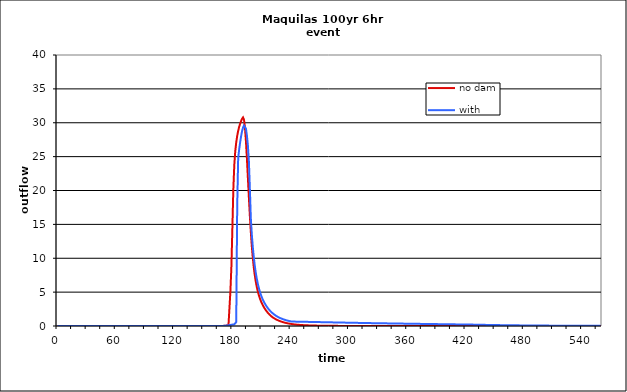
| Category | no dam | with dam |
|---|---|---|
| 0.0 | 0 | 0 |
| 1.0 | 0 | 0 |
| 2.0 | 0 | 0 |
| 3.0 | 0 | 0 |
| 4.0 | 0 | 0 |
| 5.0 | 0 | 0 |
| 6.0 | 0 | 0 |
| 7.0 | 0 | 0 |
| 8.0 | 0 | 0 |
| 9.0 | 0 | 0 |
| 10.0 | 0 | 0 |
| 11.0 | 0 | 0 |
| 12.0 | 0 | 0 |
| 13.0 | 0 | 0 |
| 14.0 | 0 | 0 |
| 15.0 | 0 | 0 |
| 16.0 | 0 | 0 |
| 17.0 | 0 | 0 |
| 18.0 | 0 | 0 |
| 19.0 | 0 | 0 |
| 20.0 | 0 | 0 |
| 21.0 | 0 | 0 |
| 22.0 | 0 | 0 |
| 23.0 | 0 | 0 |
| 24.0 | 0 | 0 |
| 25.0 | 0 | 0 |
| 26.0 | 0 | 0 |
| 27.0 | 0 | 0 |
| 28.0 | 0 | 0 |
| 29.0 | 0 | 0 |
| 30.0 | 0 | 0 |
| 31.0 | 0 | 0 |
| 32.0 | 0 | 0 |
| 33.0 | 0 | 0 |
| 34.0 | 0 | 0 |
| 35.0 | 0 | 0 |
| 36.0 | 0 | 0 |
| 37.0 | 0 | 0 |
| 38.0 | 0 | 0 |
| 39.0 | 0 | 0 |
| 40.0 | 0 | 0 |
| 41.0 | 0 | 0 |
| 42.0 | 0 | 0 |
| 43.0 | 0 | 0 |
| 44.0 | 0 | 0 |
| 45.0 | 0 | 0 |
| 46.0 | 0 | 0 |
| 47.0 | 0 | 0 |
| 48.0 | 0 | 0 |
| 49.0 | 0 | 0 |
| 50.0 | 0 | 0 |
| 51.0 | 0 | 0 |
| 52.0 | 0 | 0 |
| 53.0 | 0 | 0 |
| 54.0 | 0 | 0 |
| 55.0 | 0 | 0 |
| 56.0 | 0 | 0 |
| 57.0 | 0 | 0 |
| 58.0 | 0 | 0 |
| 59.0 | 0 | 0 |
| 60.0 | 0 | 0 |
| 61.0 | 0 | 0 |
| 62.0 | 0 | 0 |
| 63.0 | 0 | 0 |
| 64.0 | 0 | 0 |
| 65.0 | 0 | 0 |
| 66.0 | 0 | 0 |
| 67.0 | 0 | 0 |
| 68.0 | 0 | 0 |
| 69.0 | 0 | 0 |
| 70.0 | 0 | 0 |
| 71.0 | 0 | 0 |
| 72.0 | 0 | 0 |
| 73.0 | 0 | 0 |
| 74.0 | 0 | 0 |
| 75.0 | 0 | 0 |
| 76.0 | 0 | 0 |
| 77.0 | 0 | 0 |
| 78.0 | 0 | 0 |
| 79.0 | 0 | 0 |
| 80.0 | 0 | 0 |
| 81.0 | 0 | 0 |
| 82.0 | 0 | 0 |
| 83.0 | 0 | 0 |
| 84.0 | 0 | 0 |
| 85.0 | 0 | 0 |
| 86.0 | 0 | 0 |
| 87.0 | 0 | 0 |
| 88.0 | 0 | 0 |
| 89.0 | 0 | 0 |
| 90.0 | 0 | 0 |
| 91.0 | 0 | 0 |
| 92.0 | 0 | 0 |
| 93.0 | 0 | 0 |
| 94.0 | 0 | 0 |
| 95.0 | 0 | 0 |
| 96.0 | 0 | 0 |
| 97.0 | 0 | 0 |
| 98.0 | 0 | 0 |
| 99.0 | 0 | 0 |
| 100.0 | 0 | 0 |
| 101.0 | 0 | 0 |
| 102.0 | 0 | 0 |
| 103.0 | 0 | 0 |
| 104.0 | 0 | 0 |
| 105.0 | 0 | 0 |
| 106.0 | 0 | 0 |
| 107.0 | 0 | 0 |
| 108.0 | 0 | 0 |
| 109.0 | 0 | 0 |
| 110.0 | 0 | 0 |
| 111.0 | 0 | 0 |
| 112.0 | 0 | 0 |
| 113.0 | 0 | 0 |
| 114.0 | 0 | 0 |
| 115.0 | 0 | 0 |
| 116.0 | 0 | 0 |
| 117.0 | 0 | 0 |
| 118.0 | 0 | 0 |
| 119.0 | 0 | 0 |
| 120.0 | 0 | 0 |
| 121.0 | 0 | 0 |
| 122.0 | 0 | 0 |
| 123.0 | 0 | 0 |
| 124.0 | 0 | 0 |
| 125.0 | 0 | 0 |
| 126.0 | 0 | 0 |
| 127.0 | 0 | 0 |
| 128.0 | 0 | 0 |
| 129.0 | 0 | 0 |
| 130.0 | 0 | 0 |
| 131.0 | 0 | 0 |
| 132.0 | 0 | 0 |
| 133.0 | 0 | 0 |
| 134.0 | 0 | 0 |
| 135.0 | 0 | 0 |
| 136.0 | 0 | 0 |
| 137.0 | 0 | 0 |
| 138.0 | 0 | 0 |
| 139.0 | 0 | 0 |
| 140.0 | 0 | 0 |
| 141.0 | 0 | 0 |
| 142.0 | 0 | 0 |
| 143.0 | 0 | 0 |
| 144.0 | 0 | 0 |
| 145.0 | 0 | 0 |
| 146.0 | 0 | 0 |
| 147.0 | 0 | 0 |
| 148.0 | 0 | 0 |
| 149.0 | 0 | 0 |
| 150.0 | 0 | 0 |
| 151.0 | 0 | 0 |
| 152.0 | 0 | 0 |
| 153.0 | 0 | 0 |
| 154.0 | 0 | 0 |
| 155.0 | 0 | 0 |
| 156.0 | 0.001 | 0.001 |
| 157.0 | 0.001 | 0.001 |
| 158.0 | 0.001 | 0.001 |
| 159.0 | 0.001 | 0.001 |
| 160.0 | 0.001 | 0.001 |
| 161.0 | 0.001 | 0.001 |
| 162.0 | 0.002 | 0.002 |
| 163.0 | 0.003 | 0.003 |
| 164.0 | 0.003 | 0.003 |
| 165.0 | 0.004 | 0.004 |
| 166.0 | 0.005 | 0.005 |
| 167.0 | 0.006 | 0.006 |
| 168.0 | 0.007 | 0.007 |
| 169.0 | 0.008 | 0.008 |
| 170.0 | 0.01 | 0.01 |
| 171.0 | 0.015 | 0.015 |
| 172.0 | 0.028 | 0.028 |
| 173.0 | 0.046 | 0.044 |
| 174.0 | 0.063 | 0.063 |
| 175.0 | 0.082 | 0.084 |
| 176.0 | 0.076 | 0.106 |
| 177.0 | 0 | 0.129 |
| 178.0 | 5.144 | 0.154 |
| 179.0 | 8.725 | 0.179 |
| 180.0 | 14.254 | 0.204 |
| 181.0 | 20.136 | 0.228 |
| 182.0 | 23.764 | 0.249 |
| 183.0 | 25.814 | 0.324 |
| 184.0 | 27.112 | 0.583 |
| 185.0 | 28.062 | 17.689 |
| 186.0 | 28.805 | 24.79 |
| 187.0 | 29.393 | 26.043 |
| 188.0 | 29.865 | 27.09 |
| 189.0 | 30.248 | 28.011 |
| 190.0 | 30.58 | 28.759 |
| 191.0 | 30.788 | 29.294 |
| 192.0 | 30.45 | 29.58 |
| 193.0 | 29.259 | 29.598 |
| 194.0 | 27.251 | 29.132 |
| 195.0 | 24.685 | 28.089 |
| 196.0 | 21.851 | 26.626 |
| 197.0 | 19.001 | 24.389 |
| 198.0 | 16.317 | 20.408 |
| 199.0 | 13.916 | 15.963 |
| 200.0 | 11.857 | 13.579 |
| 201.0 | 10.132 | 11.751 |
| 202.0 | 8.732 | 10.235 |
| 203.0 | 7.586 | 8.991 |
| 204.0 | 6.644 | 7.958 |
| 205.0 | 5.873 | 7.091 |
| 206.0 | 5.23 | 6.362 |
| 207.0 | 4.684 | 5.747 |
| 208.0 | 4.217 | 5.219 |
| 209.0 | 3.815 | 4.76 |
| 210.0 | 3.469 | 4.36 |
| 211.0 | 3.165 | 4.009 |
| 212.0 | 2.896 | 3.698 |
| 213.0 | 2.654 | 3.421 |
| 214.0 | 2.434 | 3.172 |
| 215.0 | 2.232 | 2.946 |
| 216.0 | 2.045 | 2.741 |
| 217.0 | 1.874 | 2.553 |
| 218.0 | 1.718 | 2.381 |
| 219.0 | 1.575 | 2.222 |
| 220.0 | 1.448 | 2.077 |
| 221.0 | 1.335 | 1.943 |
| 222.0 | 1.232 | 1.818 |
| 223.0 | 1.139 | 1.703 |
| 224.0 | 1.054 | 1.597 |
| 225.0 | 0.975 | 1.499 |
| 226.0 | 0.904 | 1.412 |
| 227.0 | 0.838 | 1.332 |
| 228.0 | 0.776 | 1.259 |
| 229.0 | 0.719 | 1.191 |
| 230.0 | 0.667 | 1.127 |
| 231.0 | 0.618 | 1.068 |
| 232.0 | 0.573 | 1.013 |
| 233.0 | 0.531 | 0.961 |
| 234.0 | 0.493 | 0.913 |
| 235.0 | 0.457 | 0.867 |
| 236.0 | 0.424 | 0.825 |
| 237.0 | 0.394 | 0.785 |
| 238.0 | 0.366 | 0.748 |
| 239.0 | 0.339 | 0.714 |
| 240.0 | 0.315 | 0.685 |
| 241.0 | 0.293 | 0.665 |
| 242.0 | 0.272 | 0.655 |
| 243.0 | 0.253 | 0.651 |
| 244.0 | 0.235 | 0.648 |
| 245.0 | 0.219 | 0.645 |
| 246.0 | 0.204 | 0.643 |
| 247.0 | 0.19 | 0.64 |
| 248.0 | 0.178 | 0.637 |
| 249.0 | 0.166 | 0.635 |
| 250.0 | 0.156 | 0.632 |
| 251.0 | 0.146 | 0.629 |
| 252.0 | 0.137 | 0.627 |
| 253.0 | 0.128 | 0.624 |
| 254.0 | 0.12 | 0.621 |
| 255.0 | 0.113 | 0.618 |
| 256.0 | 0.106 | 0.615 |
| 257.0 | 0.1 | 0.612 |
| 258.0 | 0.094 | 0.609 |
| 259.0 | 0.088 | 0.606 |
| 260.0 | 0.083 | 0.603 |
| 261.0 | 0.078 | 0.6 |
| 262.0 | 0.074 | 0.598 |
| 263.0 | 0.069 | 0.595 |
| 264.0 | 0.065 | 0.592 |
| 265.0 | 0.062 | 0.589 |
| 266.0 | 0.058 | 0.586 |
| 267.0 | 0.055 | 0.583 |
| 268.0 | 0.052 | 0.58 |
| 269.0 | 0.049 | 0.577 |
| 270.0 | 0.046 | 0.574 |
| 271.0 | 0.044 | 0.571 |
| 272.0 | 0.042 | 0.568 |
| 273.0 | 0.04 | 0.565 |
| 274.0 | 0.038 | 0.562 |
| 275.0 | 0.036 | 0.559 |
| 276.0 | 0.034 | 0.556 |
| 277.0 | 0.032 | 0.553 |
| 278.0 | 0.03 | 0.551 |
| 279.0 | 0.029 | 0.548 |
| 280.0 | 0.028 | 0.545 |
| 281.0 | 0.026 | 0.542 |
| 282.0 | 0.025 | 0.539 |
| 283.0 | 0.024 | 0.536 |
| 284.0 | 0.023 | 0.533 |
| 285.0 | 0.021 | 0.53 |
| 286.0 | 0.02 | 0.527 |
| 287.0 | 0.019 | 0.524 |
| 288.0 | 0.019 | 0.522 |
| 289.0 | 0.018 | 0.519 |
| 290.0 | 0.017 | 0.516 |
| 291.0 | 0.016 | 0.513 |
| 292.0 | 0.015 | 0.51 |
| 293.0 | 0.015 | 0.507 |
| 294.0 | 0.014 | 0.504 |
| 295.0 | 0.013 | 0.501 |
| 296.0 | 0.013 | 0.499 |
| 297.0 | 0.012 | 0.496 |
| 298.0 | 0.012 | 0.493 |
| 299.0 | 0.011 | 0.49 |
| 300.0 | 0.01 | 0.487 |
| 301.0 | 0.01 | 0.484 |
| 302.0 | 0.009 | 0.482 |
| 303.0 | 0.009 | 0.479 |
| 304.0 | 0.009 | 0.476 |
| 305.0 | 0.008 | 0.473 |
| 306.0 | 0.008 | 0.47 |
| 307.0 | 0.007 | 0.467 |
| 308.0 | 0.007 | 0.465 |
| 309.0 | 0.006 | 0.462 |
| 310.0 | 0.006 | 0.459 |
| 311.0 | 0.006 | 0.456 |
| 312.0 | 0.005 | 0.454 |
| 313.0 | 0.005 | 0.451 |
| 314.0 | 0.004 | 0.448 |
| 315.0 | 0.004 | 0.445 |
| 316.0 | 0.004 | 0.443 |
| 317.0 | 0.003 | 0.44 |
| 318.0 | 0.003 | 0.437 |
| 319.0 | 0.003 | 0.435 |
| 320.0 | 0.003 | 0.432 |
| 321.0 | 0.002 | 0.429 |
| 322.0 | 0.002 | 0.427 |
| 323.0 | 0.002 | 0.424 |
| 324.0 | 0.002 | 0.422 |
| 325.0 | 0.002 | 0.419 |
| 326.0 | 0.001 | 0.417 |
| 327.0 | 0.001 | 0.415 |
| 328.0 | 0.001 | 0.413 |
| 329.0 | 0.001 | 0.41 |
| 330.0 | 0.001 | 0.408 |
| 331.0 | 0.001 | 0.406 |
| 332.0 | 0.001 | 0.404 |
| 333.0 | 0.001 | 0.401 |
| 334.0 | 0.001 | 0.399 |
| 335.0 | 0 | 0.397 |
| 336.0 | 0 | 0.395 |
| 337.0 | 0 | 0.393 |
| 338.0 | 0 | 0.39 |
| 339.0 | 0 | 0.388 |
| 340.0 | 0 | 0.386 |
| 341.0 | 0 | 0.384 |
| 342.0 | 0 | 0.381 |
| 343.0 | 0 | 0.379 |
| 344.0 | 0 | 0.377 |
| 345.0 | 0 | 0.375 |
| 346.0 | 0 | 0.373 |
| 347.0 | 0 | 0.37 |
| 348.0 | 0 | 0.368 |
| 349.0 | 0 | 0.366 |
| 350.0 | 0 | 0.364 |
| 351.0 | 0 | 0.362 |
| 352.0 | 0 | 0.359 |
| 353.0 | 0 | 0.357 |
| 354.0 | 0 | 0.355 |
| 355.0 | 0 | 0.353 |
| 356.0 | 0 | 0.351 |
| 357.0 | 0 | 0.349 |
| 358.0 | 0 | 0.346 |
| 359.0 | 0 | 0.344 |
| 360.0 | 0 | 0.342 |
| 361.0 | 0 | 0.34 |
| 362.0 | 0 | 0.338 |
| 363.0 | 0 | 0.336 |
| 364.0 | 0 | 0.334 |
| 365.0 | 0 | 0.331 |
| 366.0 | 0 | 0.329 |
| 367.0 | 0 | 0.327 |
| 368.0 | 0 | 0.325 |
| 369.0 | 0 | 0.323 |
| 370.0 | 0 | 0.321 |
| 371.0 | 0 | 0.319 |
| 372.0 | 0 | 0.316 |
| 373.0 | 0 | 0.314 |
| 374.0 | 0 | 0.312 |
| 375.0 | 0 | 0.31 |
| 376.0 | 0 | 0.308 |
| 377.0 | 0 | 0.306 |
| 378.0 | 0 | 0.304 |
| 379.0 | 0 | 0.302 |
| 380.0 | 0 | 0.3 |
| 381.0 | 0 | 0.298 |
| 382.0 | 0 | 0.295 |
| 383.0 | 0 | 0.293 |
| 384.0 | 0 | 0.291 |
| 385.0 | 0 | 0.289 |
| 386.0 | 0 | 0.287 |
| 387.0 | 0 | 0.285 |
| 388.0 | 0 | 0.283 |
| 389.0 | 0 | 0.281 |
| 390.0 | 0 | 0.279 |
| 391.0 | 0 | 0.277 |
| 392.0 | 0 | 0.275 |
| 393.0 | 0 | 0.273 |
| 394.0 | 0 | 0.271 |
| 395.0 | 0 | 0.269 |
| 396.0 | 0 | 0.267 |
| 397.0 | 0 | 0.265 |
| 398.0 | 0 | 0.263 |
| 399.0 | 0 | 0.261 |
| 400.0 | 0 | 0.259 |
| 401.0 | 0 | 0.256 |
| 402.0 | 0 | 0.254 |
| 403.0 | 0 | 0.252 |
| 404.0 | 0 | 0.25 |
| 405.0 | 0 | 0.248 |
| 406.0 | 0 | 0.246 |
| 407.0 | 0 | 0.244 |
| 408.0 | 0 | 0.242 |
| 409.0 | 0 | 0.24 |
| 410.0 | 0 | 0.239 |
| 411.0 | 0 | 0.237 |
| 412.0 | 0 | 0.235 |
| 413.0 | 0 | 0.233 |
| 414.0 | 0 | 0.231 |
| 415.0 | 0 | 0.229 |
| 416.0 | 0 | 0.227 |
| 417.0 | 0 | 0.225 |
| 418.0 | 0 | 0.223 |
| 419.0 | 0 | 0.221 |
| 420.0 | 0 | 0.219 |
| 421.0 | 0 | 0.217 |
| 422.0 | 0 | 0.215 |
| 423.0 | 0 | 0.213 |
| 424.0 | 0 | 0.211 |
| 425.0 | 0 | 0.209 |
| 426.0 | 0 | 0.207 |
| 427.0 | 0 | 0.205 |
| 428.0 | 0 | 0.203 |
| 429.0 | 0 | 0.2 |
| 430.0 | 0 | 0.198 |
| 431.0 | 0 | 0.195 |
| 432.0 | 0 | 0.192 |
| 433.0 | 0 | 0.188 |
| 434.0 | 0 | 0.185 |
| 435.0 | 0 | 0.182 |
| 436.0 | 0 | 0.179 |
| 437.0 | 0 | 0.176 |
| 438.0 | 0 | 0.173 |
| 439.0 | 0 | 0.17 |
| 440.0 | 0 | 0.168 |
| 441.0 | 0 | 0.165 |
| 442.0 | 0 | 0.162 |
| 443.0 | 0 | 0.159 |
| 444.0 | 0 | 0.157 |
| 445.0 | 0 | 0.154 |
| 446.0 | 0 | 0.151 |
| 447.0 | 0 | 0.149 |
| 448.0 | 0 | 0.147 |
| 449.0 | 0 | 0.144 |
| 450.0 | 0 | 0.142 |
| 451.0 | 0 | 0.139 |
| 452.0 | 0 | 0.137 |
| 453.0 | 0 | 0.135 |
| 454.0 | 0 | 0.132 |
| 455.0 | 0 | 0.13 |
| 456.0 | 0 | 0.128 |
| 457.0 | 0 | 0.126 |
| 458.0 | 0 | 0.124 |
| 459.0 | 0 | 0.122 |
| 460.0 | 0 | 0.12 |
| 461.0 | 0 | 0.118 |
| 462.0 | 0 | 0.116 |
| 463.0 | 0 | 0.114 |
| 464.0 | 0 | 0.112 |
| 465.0 | 0 | 0.11 |
| 466.0 | 0 | 0.108 |
| 467.0 | 0 | 0.106 |
| 468.0 | 0 | 0.105 |
| 469.0 | 0 | 0.103 |
| 470.0 | 0 | 0.101 |
| 471.0 | 0 | 0.1 |
| 472.0 | 0 | 0.098 |
| 473.0 | 0 | 0.096 |
| 474.0 | 0 | 0.095 |
| 475.0 | 0 | 0.093 |
| 476.0 | 0 | 0.091 |
| 477.0 | 0 | 0.09 |
| 478.0 | 0 | 0.088 |
| 479.0 | 0 | 0.087 |
| 480.0 | 0 | 0.086 |
| 481.0 | 0 | 0.084 |
| 482.0 | 0 | 0.083 |
| 483.0 | 0 | 0.081 |
| 484.0 | 0 | 0.08 |
| 485.0 | 0 | 0.079 |
| 486.0 | 0 | 0.077 |
| 487.0 | 0 | 0.076 |
| 488.0 | 0 | 0.075 |
| 489.0 | 0 | 0.073 |
| 490.0 | 0 | 0.072 |
| 491.0 | 0 | 0.071 |
| 492.0 | 0 | 0.07 |
| 493.0 | 0 | 0.069 |
| 494.0 | 0 | 0.067 |
| 495.0 | 0 | 0.066 |
| 496.0 | 0 | 0.065 |
| 497.0 | 0 | 0.064 |
| 498.0 | 0 | 0.063 |
| 499.0 | 0 | 0.062 |
| 500.0 | 0 | 0.061 |
| 501.0 | 0 | 0.06 |
| 502.0 | 0 | 0.059 |
| 503.0 | 0 | 0.058 |
| 504.0 | 0 | 0.057 |
| 505.0 | 0 | 0.056 |
| 506.0 | 0 | 0.055 |
| 507.0 | 0 | 0.054 |
| 508.0 | 0 | 0.053 |
| 509.0 | 0 | 0.052 |
| 510.0 | 0 | 0.051 |
| 511.0 | 0 | 0.051 |
| 512.0 | 0 | 0.05 |
| 513.0 | 0 | 0.049 |
| 514.0 | 0 | 0.048 |
| 515.0 | 0 | 0.047 |
| 516.0 | 0 | 0.046 |
| 517.0 | 0 | 0.046 |
| 518.0 | 0 | 0.045 |
| 519.0 | 0 | 0.044 |
| 520.0 | 0 | 0.043 |
| 521.0 | 0 | 0.043 |
| 522.0 | 0 | 0.042 |
| 523.0 | 0 | 0.041 |
| 524.0 | 0 | 0.04 |
| 525.0 | 0 | 0.04 |
| 526.0 | 0 | 0.039 |
| 527.0 | 0 | 0.038 |
| 528.0 | 0 | 0.038 |
| 529.0 | 0 | 0.037 |
| 530.0 | 0 | 0.037 |
| 531.0 | 0 | 0.036 |
| 532.0 | 0 | 0.035 |
| 533.0 | 0 | 0.035 |
| 534.0 | 0 | 0.034 |
| 535.0 | 0 | 0.034 |
| 536.0 | 0 | 0.033 |
| 537.0 | 0 | 0.032 |
| 538.0 | 0 | 0.032 |
| 539.0 | 0 | 0.031 |
| 540.0 | 0 | 0.031 |
| 541.0 | 0 | 0.03 |
| 542.0 | 0 | 0.03 |
| 543.0 | 0 | 0.029 |
| 544.0 | 0 | 0.029 |
| 545.0 | 0 | 0.028 |
| 546.0 | 0 | 0.028 |
| 547.0 | 0 | 0.027 |
| 548.0 | 0 | 0.027 |
| 549.0 | 0 | 0.026 |
| 550.0 | 0 | 0.026 |
| 551.0 | 0 | 0.025 |
| 552.0 | 0 | 0.025 |
| 553.0 | 0 | 0.025 |
| 554.0 | 0 | 0.024 |
| 555.0 | 0 | 0.024 |
| 556.0 | 0 | 0.023 |
| 557.0 | 0 | 0.023 |
| 558.0 | 0 | 0.023 |
| 559.0 | 0 | 0.022 |
| 560.0 | 0 | 0.022 |